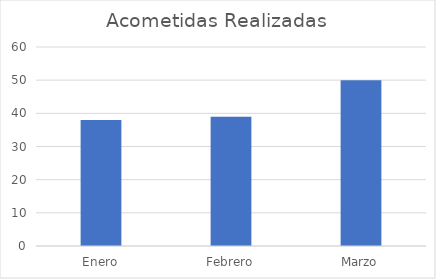
| Category | Acometidas Realizadas |
|---|---|
| Enero | 38 |
| Febrero | 39 |
| Marzo | 50 |